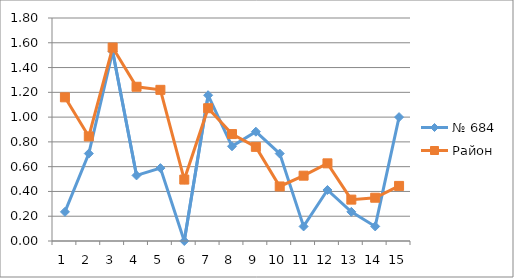
| Category | № 684 | Район |
|---|---|---|
| 0 | 0.235 | 1.16 |
| 1 | 0.706 | 0.844 |
| 2 | 1.529 | 1.562 |
| 3 | 0.529 | 1.245 |
| 4 | 0.588 | 1.22 |
| 5 | 0 | 0.496 |
| 6 | 1.176 | 1.072 |
| 7 | 0.765 | 0.863 |
| 8 | 0.882 | 0.76 |
| 9 | 0.706 | 0.44 |
| 10 | 0.118 | 0.527 |
| 11 | 0.412 | 0.627 |
| 12 | 0.235 | 0.334 |
| 13 | 0.118 | 0.349 |
| 14 | 1 | 0.445 |